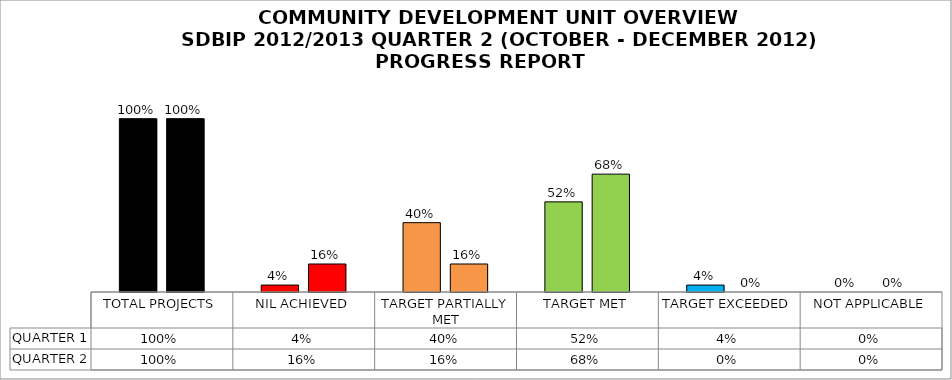
| Category | QUARTER 1 | QUARTER 2 |
|---|---|---|
| TOTAL PROJECTS | 1 | 1 |
| NIL ACHIEVED | 0.04 | 0.162 |
| TARGET PARTIALLY MET | 0.4 | 0.162 |
| TARGET MET | 0.52 | 0.68 |
| TARGET EXCEEDED | 0.04 | 0 |
| NOT APPLICABLE | 0 | 0 |